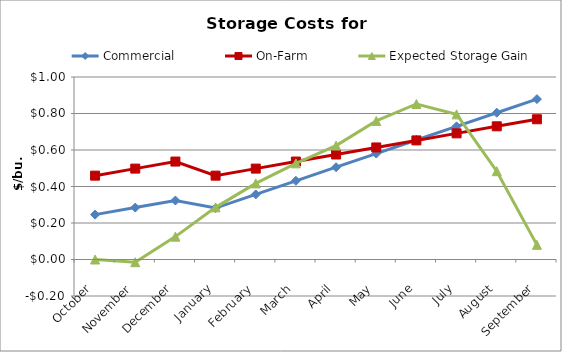
| Category | Commercial | On-Farm | Expected Storage Gain |
|---|---|---|---|
| October | 0.246 | 0.459 | 0 |
| November | 0.285 | 0.498 | -0.015 |
| December | 0.323 | 0.537 | 0.125 |
| January | 0.282 | 0.459 | 0.286 |
| February | 0.357 | 0.498 | 0.417 |
| March | 0.431 | 0.537 | 0.527 |
| April | 0.506 | 0.575 | 0.624 |
| May | 0.58 | 0.614 | 0.759 |
| June | 0.655 | 0.653 | 0.852 |
| July | 0.73 | 0.691 | 0.795 |
| August | 0.804 | 0.73 | 0.484 |
| September | 0.879 | 0.768 | 0.08 |